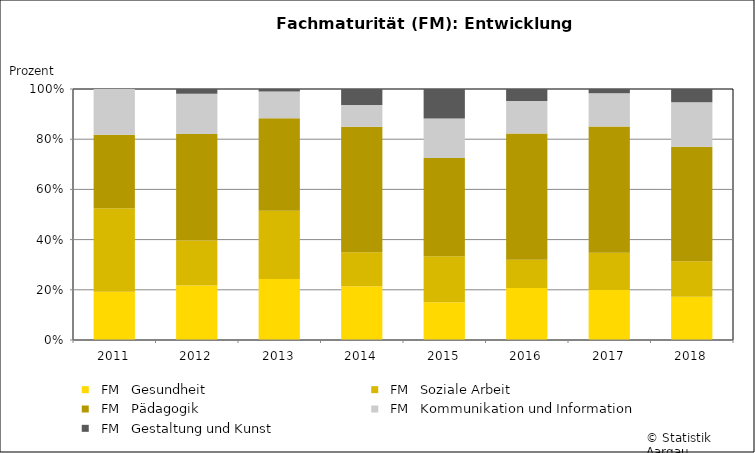
| Category |   FM   Gesundheit |   FM   Soziale Arbeit |   FM   Pädagogik |   FM   Kommunikation und Information |   FM   Gestaltung und Kunst |
|---|---|---|---|---|---|
| 2011 | 19 | 33 | 29 | 18 | 0 |
| 2012 | 23 | 19 | 45 | 17 | 2 |
| 2013 | 25 | 28 | 38 | 11 | 1 |
| 2014 | 27 | 17 | 63 | 11 | 8 |
| 2015 | 23 | 28 | 60 | 24 | 18 |
| 2016 | 35 | 19 | 85 | 22 | 8 |
| 2017 | 36 | 27 | 91 | 24 | 3 |
| 2018 | 33 | 27 | 87 | 34 | 10 |